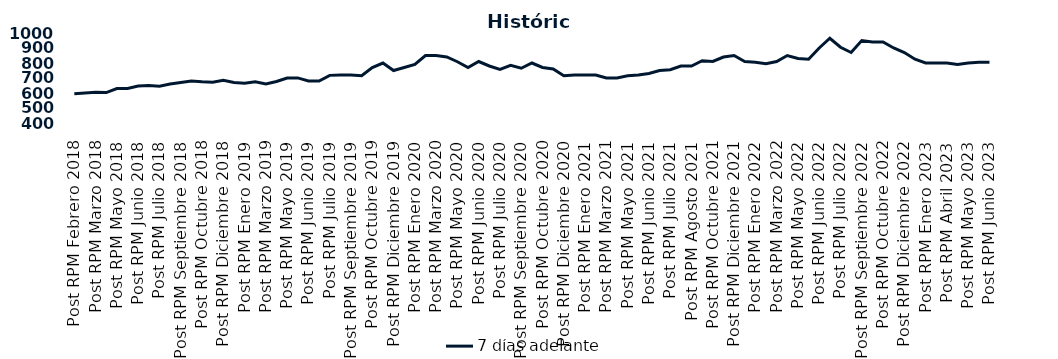
| Category | 7 días adelante  |
|---|---|
| Post RPM Febrero 2018 | 595 |
| Pre RPM Marzo 2018 | 600 |
| Post RPM Marzo 2018 | 605 |
| Pre RPM Mayo 2018 | 603 |
| Post RPM Mayo 2018 | 630 |
| Pre RPM Junio 2018 | 630 |
| Post RPM Junio 2018 | 646.5 |
| Pre RPM Julio 2018 | 650 |
| Post RPM Julio 2018 | 645 |
| Pre RPM Septiembre 2018 | 660 |
| Post RPM Septiembre 2018 | 670 |
| Pre RPM Octubre 2018 | 680 |
| Post RPM Octubre 2018 | 675 |
| Pre RPM Diciembre 2018 | 672.5 |
| Post RPM Diciembre 2018 | 685 |
| Pre RPM Enero 2019 | 670 |
| Post RPM Enero 2019 | 665 |
| Pre RPM Marzo 2019 | 675 |
| Post RPM Marzo 2019 | 661 |
| Pre RPM Mayo 2019 | 677 |
| Post RPM Mayo 2019 | 700 |
| Pre RPM Junio 2019 | 700.5 |
| Post RPM Junio 2019 | 680 |
| Pre RPM Julio 2019 | 680 |
| Post RPM Julio 2019 | 717.5 |
| Pre RPM Septiembre 2019 | 720 |
| Post RPM Septiembre 2019 | 720 |
| Pre RPM Octubre 2019 | 715 |
| Post RPM Octubre 2019 | 770 |
| Pre RPM Diciembre 2019 | 800 |
| Post RPM Diciembre 2019 | 750 |
| Pre RPM Enero 2020 | 770 |
| Post RPM Enero 2020 | 790 |
| Pre RPM Marzo 2020 | 850 |
| Post RPM Marzo 2020 | 850 |
| Pre RPM Mayo 2020 | 840 |
| Post RPM Mayo 2020 | 808.5 |
| Pre RPM Junio 2020 | 770 |
| Post RPM Junio 2020 | 810 |
| Pre RPM Julio 2020 | 780 |
| Post RPM Julio 2020 | 757 |
| Pre RPM Septiembre 2020 | 785 |
| Post RPM Septiembre 2020 | 765 |
| Pre RPM Octubre 2020 | 800 |
| Post RPM Octubre 2020 | 770 |
| Pre RPM Diciembre 2020 | 760 |
| Post RPM Diciembre 2020 | 715 |
| Pre RPM Enero 2021 | 720 |
| Post RPM Enero 2021 | 720 |
| Pre RPM Marzo 2021 | 720 |
| Post RPM Marzo 2021 | 700 |
| Pre RPM Mayo 2021 | 700 |
| Post RPM Mayo 2021 | 715 |
| Pre RPM Junio 2021 | 720 |
| Post RPM Junio 2021 | 730 |
| Pre RPM Julio 2021 | 750 |
| Post RPM Julio 2021 | 755 |
| Pre RPM Agosto 2021 | 780 |
| Post RPM Agosto 2021 | 780 |
| Pre RPM Octubre 2021 | 815 |
| Post RPM Octubre 2021 | 810 |
| Pre RPM Diciembre 2021 | 840 |
| Post RPM Diciembre 2021 | 850 |
| Pre RPM Enero 2022 | 810 |
| Post RPM Enero 2022 | 805 |
| Pre RPM Marzo 2022 | 795 |
| Post RPM Marzo 2022 | 810 |
| Pre RPM Mayo 2022 | 850 |
| Post RPM Mayo 2022 | 830 |
| Pre RPM Junio 2022 | 825 |
| Post RPM Junio 2022 | 900 |
| Pre RPM Julio 2022 | 965 |
| Post RPM Julio 2022 | 905 |
| Pre RPM Septiembre 2022 | 870 |
| Post RPM Septiembre 2022 | 950 |
| Pre RPM Octubre 2022 | 940 |
| Post RPM Octubre 2022 | 940 |
| Pre RPM Diciembre 2022 | 900 |
| Post RPM Diciembre 2022 | 870 |
| Pre RPM Enero 2023 | 825 |
| Post RPM Enero 2023 | 800 |
| Pre RPM Abril 2023 | 800 |
| Post RPM Abril 2023 | 800 |
| Pre RPM Mayo 2023 | 790 |
| Post RPM Mayo 2023 | 800 |
| Pre RPM Junio 2023 | 805 |
| Post RPM Junio 2023 | 805 |